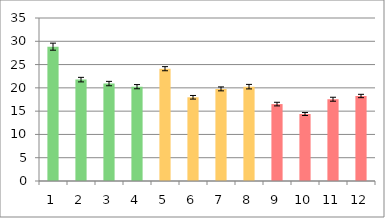
| Category | Series 0 |
|---|---|
| 0 | 28.845 |
| 1 | 21.768 |
| 2 | 20.922 |
| 3 | 20.254 |
| 4 | 24.114 |
| 5 | 17.974 |
| 6 | 19.779 |
| 7 | 20.257 |
| 8 | 16.515 |
| 9 | 14.382 |
| 10 | 17.558 |
| 11 | 18.254 |